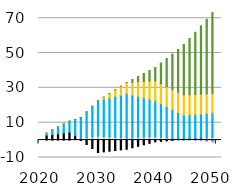
| Category | biomass | coal | natural gas | resid | solar | waste | wind |
|---|---|---|---|---|---|---|---|
| 2020.0 | 0 | 0 | 0 | 0 | 0 | 0 | 0 |
| 2021.0 | 0 | 2.716 | 1.57 | 0 | 0 | 0 | 0 |
| 2022.0 | 0.011 | 3.125 | 2.803 | 0 | 0 | 0 | 0 |
| 2023.0 | 0.021 | 3.533 | 4.036 | 0 | 0 | 0 | 0 |
| 2024.0 | 0.032 | 3.942 | 5.269 | 0 | 0 | 0 | 0 |
| 2025.0 | 0.042 | 4.351 | 6.502 | 0 | 0 | 0 | 0 |
| 2026.0 | 0.492 | 2.052 | 9.266 | 0 | 0 | 0 | 0 |
| 2027.0 | 0.942 | -0.246 | 12.029 | 0 | 0 | 0 | 0 |
| 2028.0 | 1.391 | -2.545 | 14.792 | 0 | 0 | 0 | 0 |
| 2029.0 | 1.841 | -4.844 | 17.555 | 0 | 0 | 0 | 0 |
| 2030.0 | 2.291 | -7.143 | 20.319 | 0 | 0 | 0 | 0 |
| 2031.0 | 2.068 | -6.769 | 21.358 | 0.001 | 1.274 | 0 | 0 |
| 2032.0 | 1.845 | -6.394 | 22.398 | 0.001 | 2.547 | 0 | 0 |
| 2033.0 | 1.622 | -6.02 | 23.438 | 0.002 | 3.82 | 0 | 0.001 |
| 2034.0 | 1.399 | -5.646 | 24.478 | 0.003 | 5.094 | 0 | 0.001 |
| 2035.0 | 1.177 | -5.272 | 25.517 | 0.004 | 6.367 | 0 | 0.001 |
| 2036.0 | 1.348 | -4.418 | 24.543 | 0.004 | 7.372 | 0 | 1.527 |
| 2037.0 | 1.519 | -3.564 | 23.568 | 0.004 | 8.376 | 0 | 3.053 |
| 2038.0 | 1.69 | -2.71 | 22.593 | 0.004 | 9.381 | 0 | 4.579 |
| 2039.0 | 1.861 | -1.856 | 21.618 | 0.004 | 10.385 | 0 | 6.105 |
| 2040.0 | 2.033 | -1.002 | 20.643 | 0.004 | 11.39 | 0 | 7.632 |
| 2041.0 | 1.659 | -0.737 | 19.297 | 0.004 | 11.39 | 0.104 | 11.824 |
| 2042.0 | 1.285 | -0.472 | 17.951 | 0.004 | 11.39 | 0.207 | 16.017 |
| 2043.0 | 0.912 | -0.208 | 16.605 | 0.004 | 11.39 | 0.311 | 20.21 |
| 2044.0 | 0.538 | 0.057 | 15.258 | 0.004 | 11.39 | 0.415 | 24.403 |
| 2045.0 | 0.165 | 0.322 | 13.912 | 0.004 | 11.39 | 0.519 | 28.596 |
| 2046.0 | 0.458 | 0.24 | 13.912 | 0.004 | 11.39 | 0.208 | 32.133 |
| 2047.0 | 0.751 | 0.159 | 13.912 | 0.004 | 11.39 | -0.103 | 35.67 |
| 2048.0 | 1.044 | 0.078 | 13.912 | 0.004 | 11.39 | -0.414 | 39.207 |
| 2049.0 | 1.337 | -0.003 | 13.912 | 0.004 | 11.39 | -0.725 | 42.744 |
| 2050.0 | 1.63 | -0.084 | 13.912 | 0.004 | 11.39 | -1.036 | 46.281 |